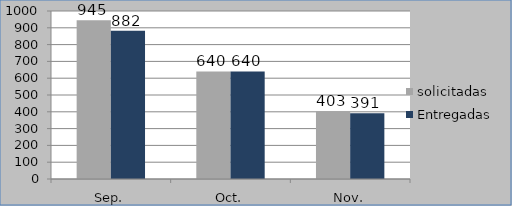
| Category | solicitadas | Entregadas |
|---|---|---|
| Sep. | 945 | 882 |
| Oct. | 640 | 640 |
| Nov. | 403 | 391 |